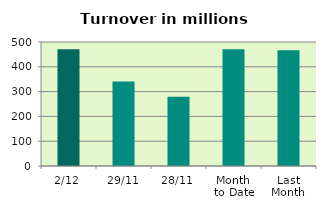
| Category | Series 0 |
|---|---|
| 2/12 | 470.978 |
| 29/11 | 341.023 |
| 28/11 | 278.848 |
| Month 
to Date | 470.978 |
| Last
Month | 466.544 |